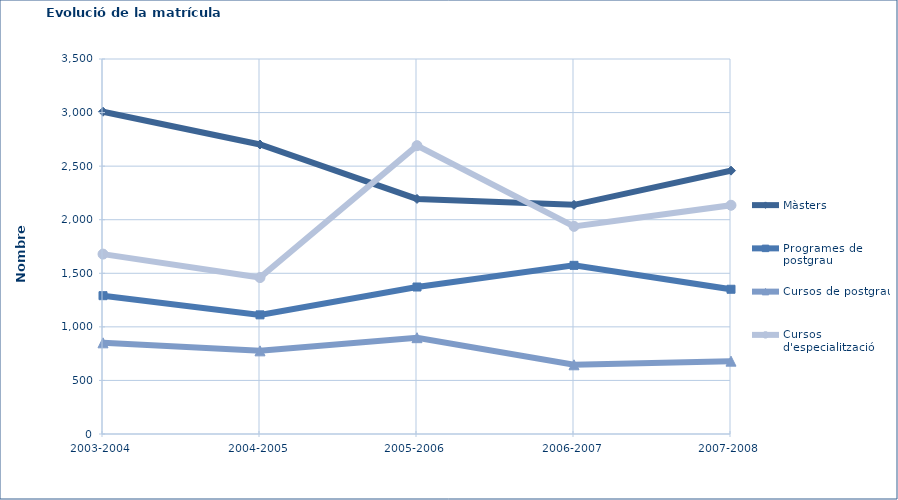
| Category | Màsters | Programes de postgrau | Cursos de postgrau | Cursos d'especialització |
|---|---|---|---|---|
| 2003-2004 | 3008 | 1291 | 851 | 1679 |
| 2004-2005 | 2702 | 1112 | 776 | 1460 |
| 2005-2006 | 2194 | 1372 | 899 | 2691 |
| 2006-2007 | 2139 | 1574 | 646 | 1938 |
| 2007-2008 | 2458 | 1351 | 680 | 2135 |